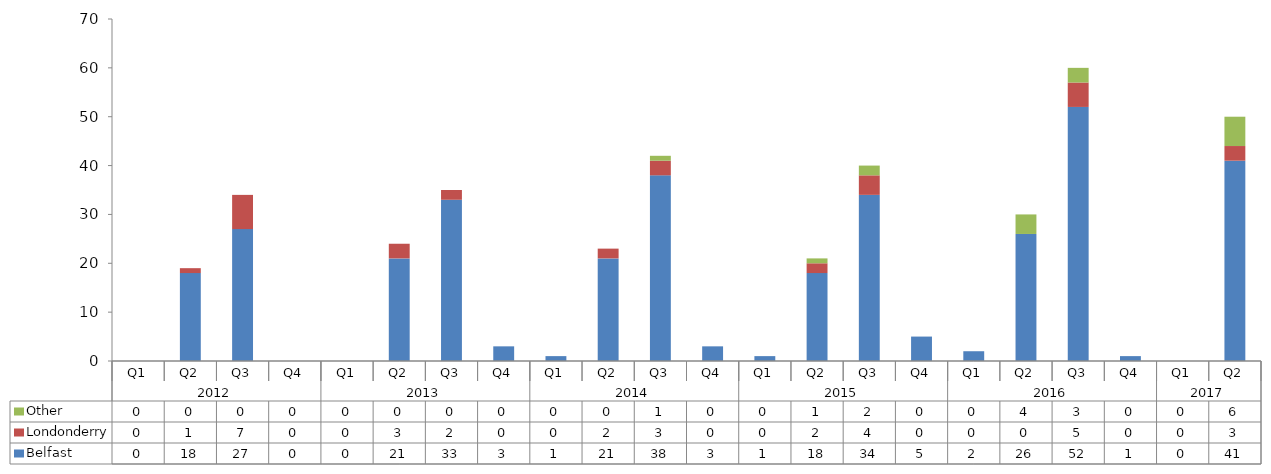
| Category | Belfast | Londonderry | Other |
|---|---|---|---|
| 0 | 0 | 0 | 0 |
| 1 | 18 | 1 | 0 |
| 2 | 27 | 7 | 0 |
| 3 | 0 | 0 | 0 |
| 4 | 0 | 0 | 0 |
| 5 | 21 | 3 | 0 |
| 6 | 33 | 2 | 0 |
| 7 | 3 | 0 | 0 |
| 8 | 1 | 0 | 0 |
| 9 | 21 | 2 | 0 |
| 10 | 38 | 3 | 1 |
| 11 | 3 | 0 | 0 |
| 12 | 1 | 0 | 0 |
| 13 | 18 | 2 | 1 |
| 14 | 34 | 4 | 2 |
| 15 | 5 | 0 | 0 |
| 16 | 2 | 0 | 0 |
| 17 | 26 | 0 | 4 |
| 18 | 52 | 5 | 3 |
| 19 | 1 | 0 | 0 |
| 20 | 0 | 0 | 0 |
| 21 | 41 | 3 | 6 |